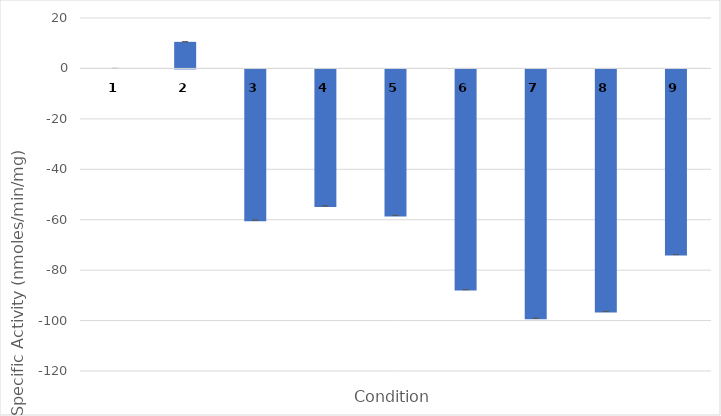
| Category | specific activity |
|---|---|
| 0 | 0 |
| 1 | 10.54 |
| 2 | -60.171 |
| 3 | -54.533 |
| 4 | -58.292 |
| 5 | -87.711 |
| 6 | -99.037 |
| 7 | -96.384 |
| 8 | -73.804 |